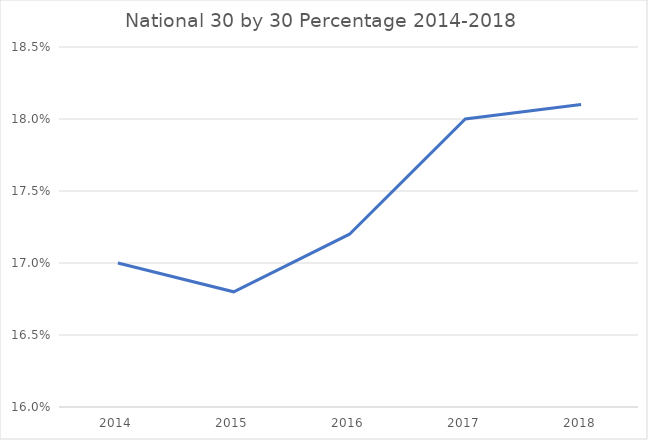
| Category | Series 0 |
|---|---|
| 2014.0 | 0.17 |
| 2015.0 | 0.168 |
| 2016.0 | 0.172 |
| 2017.0 | 0.18 |
| 2018.0 | 0.181 |